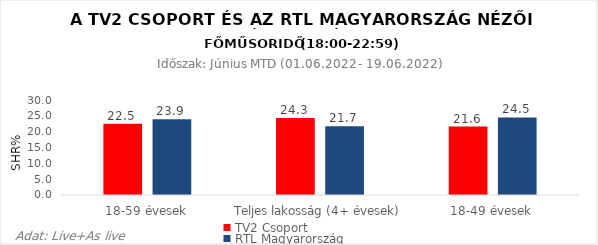
| Category | TV2 Csoport | RTL Magyarország |
|---|---|---|
| 18-59 évesek | 22.5 | 23.9 |
| Teljes lakosság (4+ évesek) | 24.3 | 21.7 |
| 18-49 évesek | 21.6 | 24.5 |